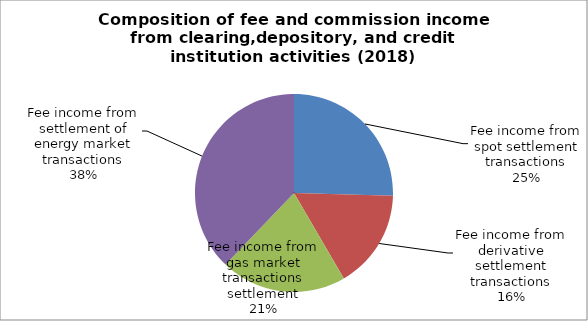
| Category | Series 0 |
|---|---|
| Fee income from spot settlement transactions | 347.695 |
| Fee income from derivative settlement transactions | 221.169 |
| Fee income from gas market transactions settlement | 281.016 |
| Fee income from settlement of energy market transactions | 517.518 |